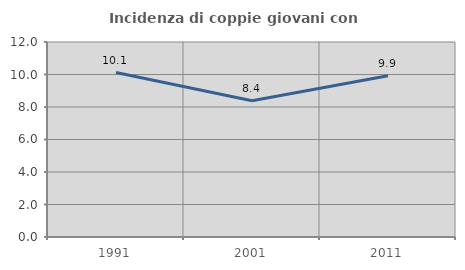
| Category | Incidenza di coppie giovani con figli |
|---|---|
| 1991.0 | 10.123 |
| 2001.0 | 8.385 |
| 2011.0 | 9.917 |